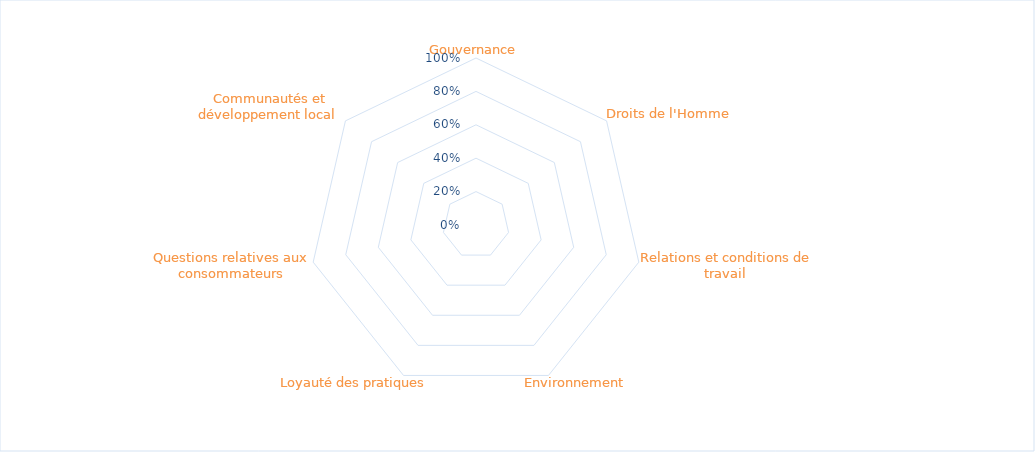
| Category | Series 0 |
|---|---|
| Gouvernance | 0 |
| Droits de l'Homme | 0 |
| Relations et conditions de travail  | 0 |
| Environnement  | 0 |
| Loyauté des pratiques  | 0 |
| Questions relatives aux consommateurs | 0 |
| Communautés et développement local  | 0 |